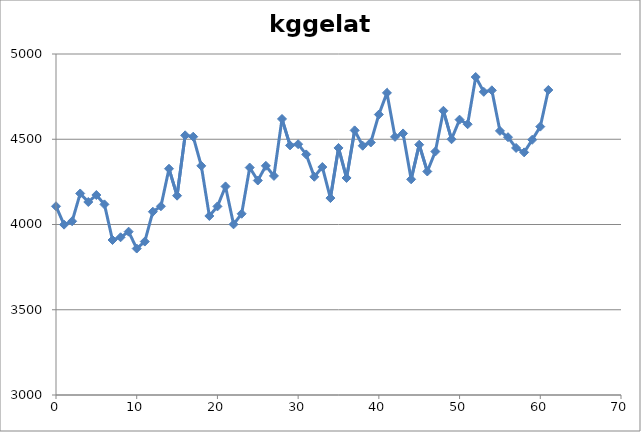
| Category | kggelato |
|---|---|
| 0.0 | 4107 |
| 1.0 | 3999 |
| 2.0 | 4019 |
| 3.0 | 4182 |
| 4.0 | 4132 |
| 5.0 | 4173 |
| 6.0 | 4118 |
| 7.0 | 3909 |
| 8.0 | 3925 |
| 9.0 | 3958 |
| 10.0 | 3859 |
| 11.0 | 3900 |
| 12.0 | 4075 |
| 13.0 | 4107 |
| 14.0 | 4327 |
| 15.0 | 4169 |
| 16.0 | 4523 |
| 17.0 | 4515 |
| 18.0 | 4344 |
| 19.0 | 4050 |
| 20.0 | 4106 |
| 21.0 | 4223 |
| 22.0 | 4001 |
| 23.0 | 4063 |
| 24.0 | 4334 |
| 25.0 | 4258 |
| 26.0 | 4344 |
| 27.0 | 4285 |
| 28.0 | 4619 |
| 29.0 | 4464 |
| 30.0 | 4471 |
| 31.0 | 4411 |
| 32.0 | 4280 |
| 33.0 | 4337 |
| 34.0 | 4155 |
| 35.0 | 4449 |
| 36.0 | 4273 |
| 37.0 | 4552 |
| 38.0 | 4462 |
| 39.0 | 4481 |
| 40.0 | 4645 |
| 41.0 | 4772 |
| 42.0 | 4514 |
| 43.0 | 4534 |
| 44.0 | 4265 |
| 45.0 | 4468 |
| 46.0 | 4311 |
| 47.0 | 4428 |
| 48.0 | 4667 |
| 49.0 | 4500 |
| 50.0 | 4615 |
| 51.0 | 4588 |
| 52.0 | 4865 |
| 53.0 | 4778 |
| 54.0 | 4787 |
| 55.0 | 4549 |
| 56.0 | 4512 |
| 57.0 | 4449 |
| 58.0 | 4423 |
| 59.0 | 4497 |
| 60.0 | 4574 |
| 61.0 | 4789 |